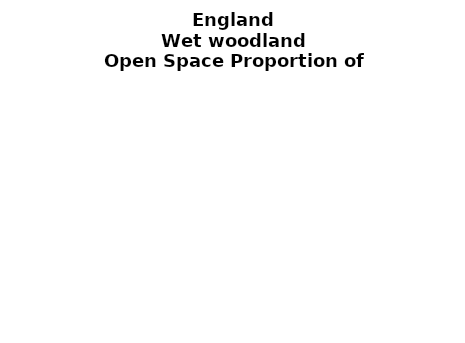
| Category | Wet woodland |
|---|---|
|  ≥ 10ha, < 10%  | 0.168 |
|   ≥ 10ha, 10-25% | 0.086 |
|   ≥ 10ha, > 25 and <50%  | 0.11 |
|   ≥ 10ha, ≥ 50%  | 0.169 |
|  < 10ha, < 10% | 0.064 |
|  < 10ha, 10-25% | 0.031 |
|  < 10ha, > 25 and < 50% | 0.101 |
|  < 10ha, ≥ 50% | 0.272 |